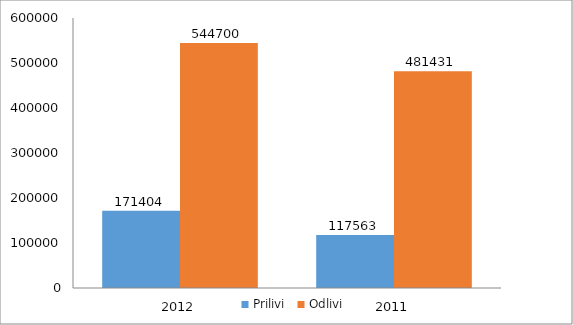
| Category | Prilivi | Odlivi |
|---|---|---|
| 2012.0 | 171404 | 544700 |
| 2011.0 | 117563 | 481431 |